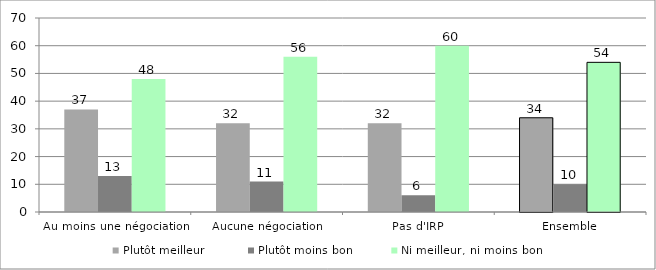
| Category | Plutôt meilleur            | Plutôt moins bon           | Ni meilleur, ni moins bon  |
|---|---|---|---|
| Au moins une négociation | 37 | 13 | 48 |
| Aucune négociation | 32 | 11 | 56 |
| Pas d'IRP | 32 | 6 | 60 |
| Ensemble | 34 | 10 | 54 |